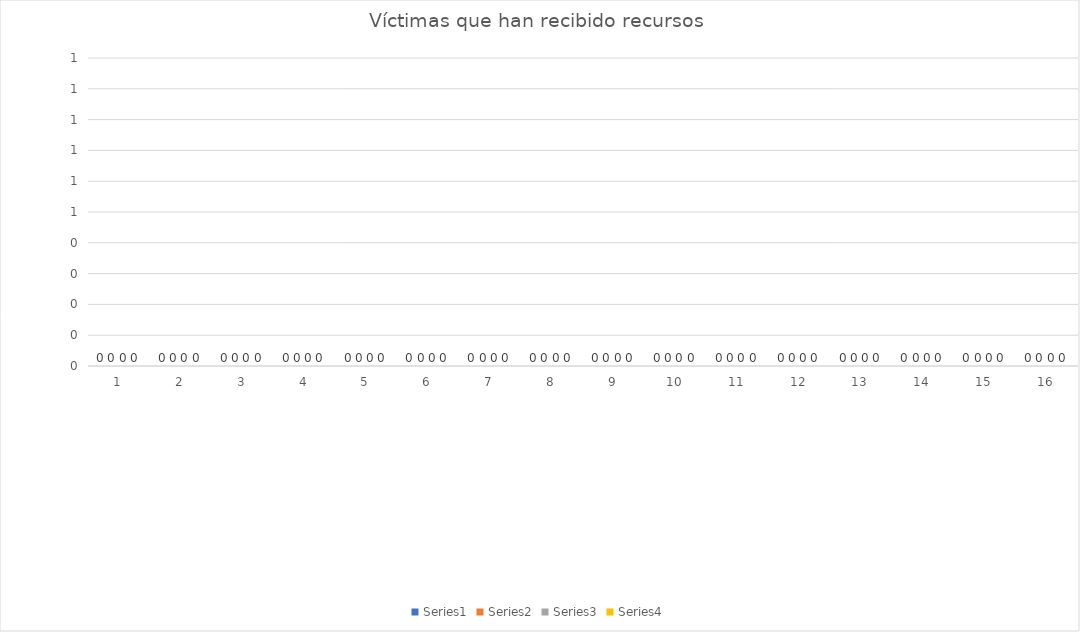
| Category | Series 0 | Series 1 | Series 2 | Series 3 |
|---|---|---|---|---|
| 0 | 97 | 2 | 9 | 52 |
| 1900-01-01 | 4891 | 21 | 6 | 23 |
| 1900-01-02 | 4212 | 21 | 0 | 38 |